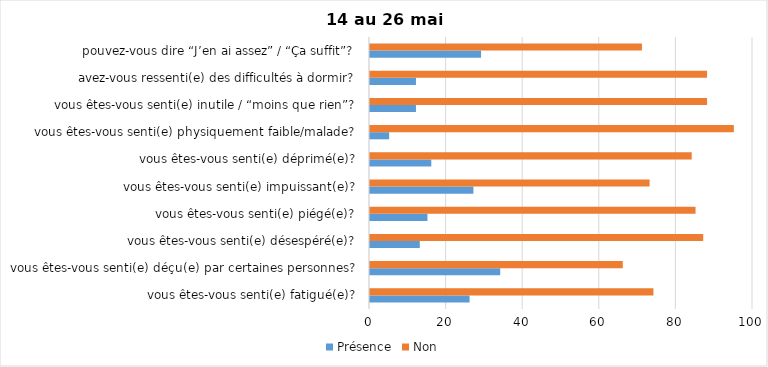
| Category | Présence | Non |
|---|---|---|
| vous êtes-vous senti(e) fatigué(e)? | 26 | 74 |
| vous êtes-vous senti(e) déçu(e) par certaines personnes? | 34 | 66 |
| vous êtes-vous senti(e) désespéré(e)? | 13 | 87 |
| vous êtes-vous senti(e) piégé(e)? | 15 | 85 |
| vous êtes-vous senti(e) impuissant(e)? | 27 | 73 |
| vous êtes-vous senti(e) déprimé(e)? | 16 | 84 |
| vous êtes-vous senti(e) physiquement faible/malade? | 5 | 95 |
| vous êtes-vous senti(e) inutile / “moins que rien”? | 12 | 88 |
| avez-vous ressenti(e) des difficultés à dormir? | 12 | 88 |
| pouvez-vous dire “J’en ai assez” / “Ça suffit”? | 29 | 71 |